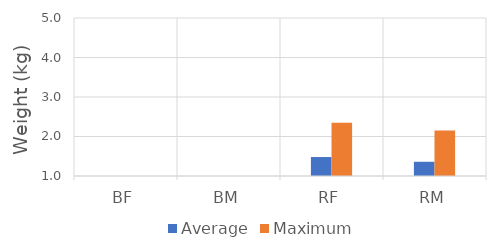
| Category | Average | Maximum |
|---|---|---|
| BF | 0 | 0 |
| BM | 0 | 0 |
| RF | 1.48 | 2.35 |
| RM | 1.36 | 2.15 |